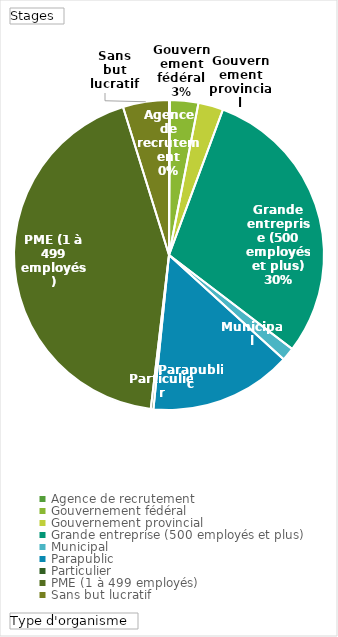
| Category | Total |
|---|---|
| Agence de recrutement | 9 |
| Gouvernement fédéral | 290 |
| Gouvernement provincial | 255 |
| Grande entreprise (500 employés et plus) | 2912 |
| Municipal | 136 |
| Parapublic | 1455 |
| Particulier | 27 |
| PME (1 à 499 employés) | 4246 |
| Sans but lucratif | 470 |